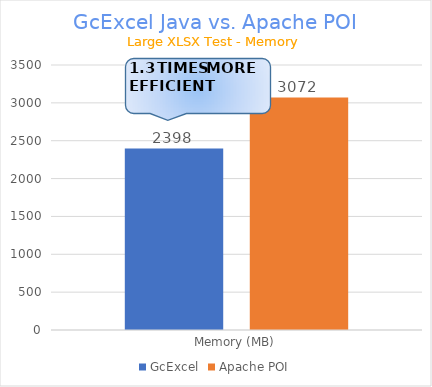
| Category | GcExcel | Apache POI |
|---|---|---|
| Memory (MB) | 2397.794 | 3072.098 |